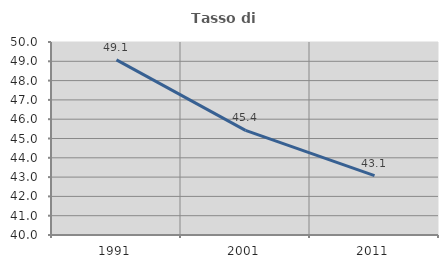
| Category | Tasso di occupazione   |
|---|---|
| 1991.0 | 49.074 |
| 2001.0 | 45.418 |
| 2011.0 | 43.077 |